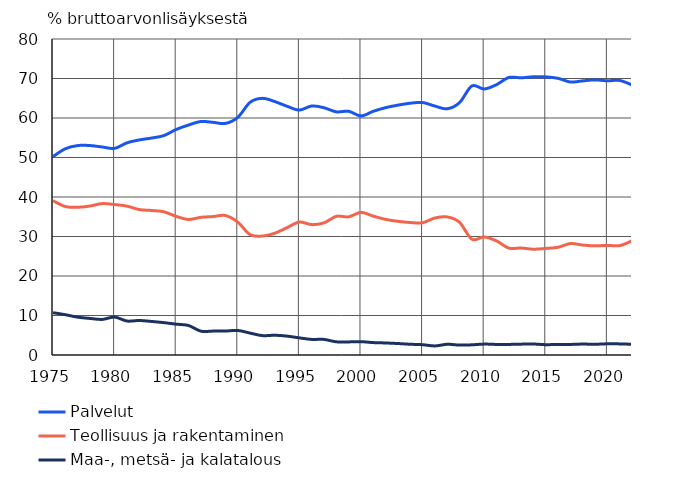
| Category | Palvelut | Teollisuus ja rakentaminen | Maa-, metsä- ja kalatalous |
|---|---|---|---|
| 1975 | 50.23 | 39.06 | 10.71 |
| 1976 | 52.213 | 37.585 | 10.202 |
| 1977 | 53.022 | 37.399 | 9.578 |
| 1978 | 53.029 | 37.712 | 9.259 |
| 1979 | 52.655 | 38.335 | 9.01 |
| 1980 | 52.314 | 38.087 | 9.6 |
| 1981 | 53.705 | 37.694 | 8.601 |
| 1982 | 54.446 | 36.817 | 8.737 |
| 1983 | 54.923 | 36.585 | 8.492 |
| 1984 | 55.548 | 36.257 | 8.195 |
| 1985 | 57.09 | 35.103 | 7.807 |
| 1986 | 58.223 | 34.309 | 7.468 |
| 1987 | 59.106 | 34.854 | 6.039 |
| 1988 | 58.899 | 35.049 | 6.052 |
| 1989 | 58.631 | 35.305 | 6.064 |
| 1990 | 60.156 | 33.633 | 6.211 |
| 1991 | 63.976 | 30.478 | 5.547 |
| 1992 | 64.979 | 30.114 | 4.906 |
| 1993 | 64.163 | 30.836 | 5.002 |
| 1994 | 62.97 | 32.246 | 4.783 |
| 1995 | 62.007 | 33.659 | 4.334 |
| 1996 | 63.045 | 33.008 | 3.948 |
| 1997 | 62.597 | 33.458 | 3.946 |
| 1998 | 61.561 | 35.105 | 3.334 |
| 1999 | 61.703 | 34.98 | 3.317 |
| 2000 | 60.52 | 36.105 | 3.376 |
| 2001 | 61.701 | 35.158 | 3.141 |
| 2002 | 62.619 | 34.334 | 3.047 |
| 2003 | 63.256 | 33.839 | 2.906 |
| 2004 | 63.742 | 33.54 | 2.717 |
| 2005 | 63.92 | 33.473 | 2.607 |
| 2006 | 63.023 | 34.682 | 2.295 |
| 2007 | 62.333 | 34.954 | 2.713 |
| 2008 | 63.897 | 33.597 | 2.506 |
| 2009 | 68.106 | 29.319 | 2.575 |
| 2010 | 67.348 | 29.888 | 2.764 |
| 2011 | 68.437 | 28.885 | 2.679 |
| 2012 | 70.256 | 27.064 | 2.679 |
| 2013 | 70.175 | 27.077 | 2.749 |
| 2014 | 70.433 | 26.785 | 2.781 |
| 2015 | 70.411 | 26.98 | 2.609 |
| 2016 | 70.043 | 27.275 | 2.682 |
| 2017 | 69.107 | 28.215 | 2.678 |
| 2018 | 69.403 | 27.829 | 2.768 |
| 2019 | 69.652 | 27.63 | 2.718 |
| 2020 | 69.415 | 27.753 | 2.831 |
| 2021 | 69.502 | 27.686 | 2.812 |
| 2022* | 68.372 | 28.919 | 2.71 |